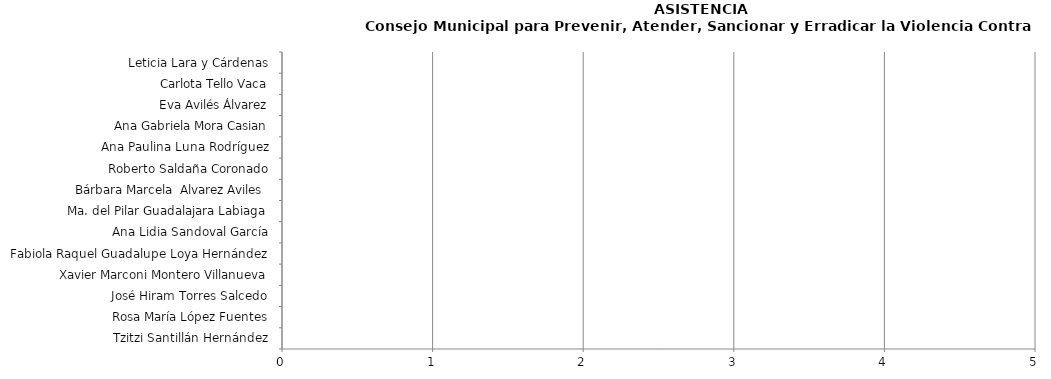
| Category | Series 0 |
|---|---|
| Tzitzi Santillán Hernández | 0 |
| Rosa María López Fuentes | 0 |
| José Hiram Torres Salcedo | 0 |
| Xavier Marconi Montero Villanueva | 0 |
| Fabiola Raquel Guadalupe Loya Hernández | 0 |
| Ana Lidia Sandoval García | 0 |
| Ma. del Pilar Guadalajara Labiaga | 0 |
| Bárbara Marcela  Alvarez Aviles  | 0 |
| Roberto Saldaña Coronado | 0 |
| Ana Paulina Luna Rodríguez | 0 |
| Ana Gabriela Mora Casian | 0 |
| Eva Avilés Álvarez | 0 |
| Carlota Tello Vaca | 0 |
| Leticia Lara y Cárdenas | 0 |